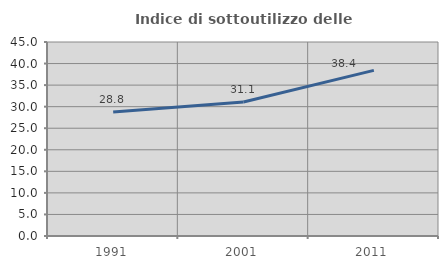
| Category | Indice di sottoutilizzo delle abitazioni  |
|---|---|
| 1991.0 | 28.772 |
| 2001.0 | 31.088 |
| 2011.0 | 38.426 |